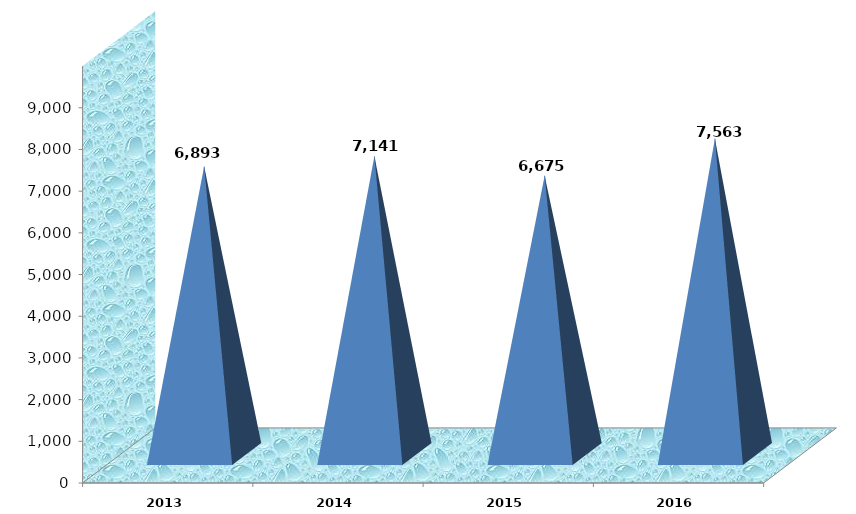
| Category | Series 0 |
|---|---|
| 2013.0 | 6893380 |
| 2014.0 | 7140850 |
| 2015.0 | 6675362 |
| 2016.0 | 7563283.233 |